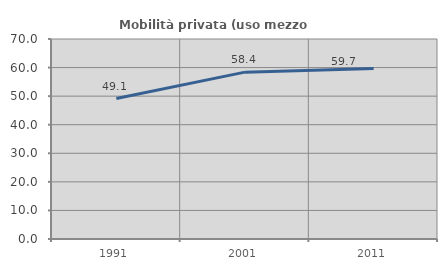
| Category | Mobilità privata (uso mezzo privato) |
|---|---|
| 1991.0 | 49.149 |
| 2001.0 | 58.405 |
| 2011.0 | 59.683 |